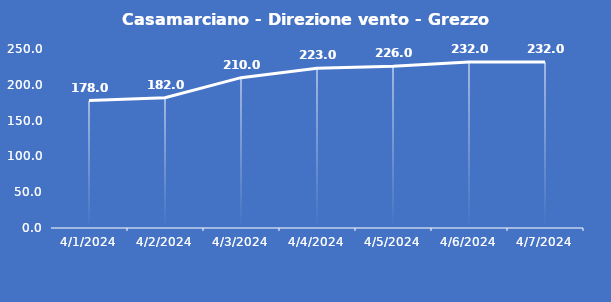
| Category | Casamarciano - Direzione vento - Grezzo (°N) |
|---|---|
| 4/1/24 | 178 |
| 4/2/24 | 182 |
| 4/3/24 | 210 |
| 4/4/24 | 223 |
| 4/5/24 | 226 |
| 4/6/24 | 232 |
| 4/7/24 | 232 |